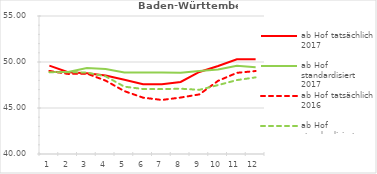
| Category | ab Hof tatsächlich 2017 | ab Hof standardisiert 2017 | ab Hof tatsächlich 2016 | ab Hof standardisiert 2016 |
|---|---|---|---|---|
| 0 | 49.604 | 48.908 | 49.03 | 48.883 |
| 1 | 48.898 | 48.906 | 48.703 | 48.891 |
| 2 | 48.777 | 49.339 | 48.738 | 48.851 |
| 3 | 48.535 | 49.234 | 47.976 | 48.442 |
| 4 | 48.062 | 48.859 | 46.834 | 47.321 |
| 5 | 47.593 | 48.867 | 46.123 | 47.064 |
| 6 | 47.569 | 48.868 | 45.876 | 47.053 |
| 7 | 47.835 | 48.844 | 46.135 | 47.098 |
| 8 | 48.918 | 49.031 | 46.479 | 46.977 |
| 9 | 49.559 | 49.19 | 47.955 | 47.492 |
| 10 | 50.302 | 49.581 | 48.823 | 48.032 |
| 11 | 50.286 | 49.441 | 49.019 | 48.33 |